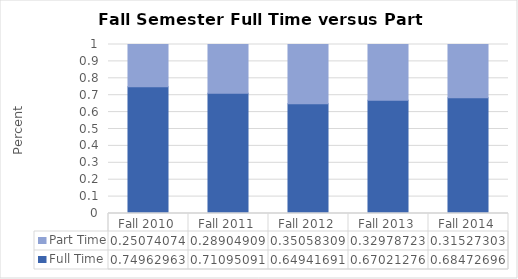
| Category | Full Time | Part Time |
|---|---|---|
| Fall 2010 | 0.75 | 0.251 |
| Fall 2011 | 0.711 | 0.289 |
| Fall 2012 | 0.649 | 0.351 |
| Fall 2013 | 0.67 | 0.33 |
| Fall 2014 | 0.685 | 0.315 |